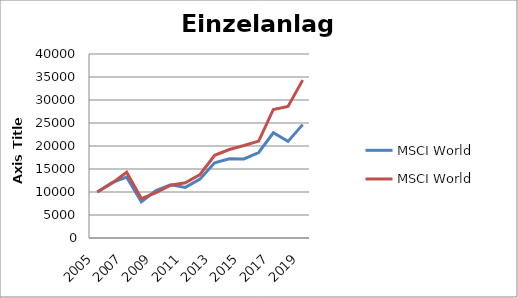
| Category | MSCI World |  MSCI World Momentum  |
|---|---|---|
| 2005.0 | 10000 | 10000 |
| 2006.0 | 12065 | 11907 |
| 2007.0 | 13219.62 | 14277.684 |
| 2008.0 | 7888.148 | 8578.032 |
| 2009.0 | 10316.908 | 9844.15 |
| 2010.0 | 11590.015 | 11472.372 |
| 2011.0 | 11008.196 | 12021.899 |
| 2012.0 | 12828.952 | 13799.938 |
| 2013.0 | 16340.236 | 17978.559 |
| 2014.0 | 17238.949 | 19242.452 |
| 2015.0 | 17183.784 | 20116.059 |
| 2016.0 | 18584.262 | 21071.572 |
| 2017.0 | 22871.652 | 27938.797 |
| 2018.0 | 20996.176 | 28603.74 |
| 2019.0 | 24645.312 | 34318.768 |